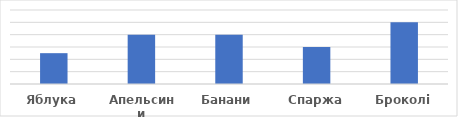
| Category | Сума |
|---|---|
| Яблука | 500 |
| Апельсини | 800 |
| Банани | 800 |
| Спаржа | 600 |
| Броколі | 1000 |